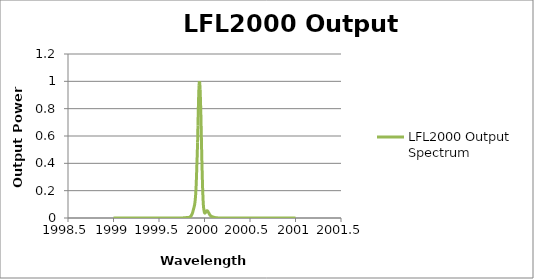
| Category | LFL2000 Output Spectrum |
|---|---|
| 1999.0 | 0 |
| 1999.004 | 0 |
| 1999.008 | 0 |
| 1999.012 | 0 |
| 1999.016 | 0 |
| 1999.02 | 0 |
| 1999.024 | 0 |
| 1999.028 | 0 |
| 1999.032 | 0 |
| 1999.036 | 0 |
| 1999.04 | 0 |
| 1999.044 | 0 |
| 1999.048 | 0 |
| 1999.052 | 0 |
| 1999.056 | 0 |
| 1999.06 | 0 |
| 1999.064 | 0 |
| 1999.068 | 0 |
| 1999.072 | 0 |
| 1999.076 | 0 |
| 1999.08 | 0 |
| 1999.084 | 0 |
| 1999.088 | 0 |
| 1999.092 | 0 |
| 1999.096 | 0 |
| 1999.1 | 0 |
| 1999.104 | 0 |
| 1999.108 | 0 |
| 1999.112 | 0 |
| 1999.116 | 0 |
| 1999.12 | 0 |
| 1999.124 | 0 |
| 1999.128 | 0 |
| 1999.132 | 0 |
| 1999.136 | 0 |
| 1999.14 | 0 |
| 1999.144 | 0 |
| 1999.148 | 0 |
| 1999.152 | 0 |
| 1999.156 | 0 |
| 1999.16 | 0 |
| 1999.164 | 0 |
| 1999.168 | 0 |
| 1999.172 | 0 |
| 1999.176 | 0 |
| 1999.18 | 0 |
| 1999.184 | 0 |
| 1999.188 | 0 |
| 1999.192 | 0 |
| 1999.196 | 0 |
| 1999.2 | 0 |
| 1999.204 | 0 |
| 1999.208 | 0 |
| 1999.212 | 0 |
| 1999.216 | 0 |
| 1999.22 | 0 |
| 1999.224 | 0 |
| 1999.228 | 0 |
| 1999.232 | 0 |
| 1999.236 | 0 |
| 1999.24 | 0 |
| 1999.244 | 0 |
| 1999.248 | 0 |
| 1999.252 | 0 |
| 1999.256 | 0 |
| 1999.26 | 0 |
| 1999.264 | 0 |
| 1999.268 | 0 |
| 1999.272 | 0 |
| 1999.276 | 0 |
| 1999.28 | 0 |
| 1999.284 | 0 |
| 1999.288 | 0 |
| 1999.292 | 0 |
| 1999.296 | 0 |
| 1999.3 | 0 |
| 1999.304 | 0 |
| 1999.308 | 0 |
| 1999.312 | 0 |
| 1999.316 | 0 |
| 1999.32 | 0 |
| 1999.324 | 0 |
| 1999.328 | 0 |
| 1999.332 | 0 |
| 1999.336 | 0 |
| 1999.34 | 0 |
| 1999.344 | 0 |
| 1999.348 | 0 |
| 1999.352 | 0 |
| 1999.356 | 0 |
| 1999.36 | 0 |
| 1999.364 | 0 |
| 1999.368 | 0 |
| 1999.372 | 0 |
| 1999.376 | 0 |
| 1999.38 | 0 |
| 1999.384 | 0 |
| 1999.388 | 0 |
| 1999.392 | 0 |
| 1999.396 | 0 |
| 1999.4 | 0 |
| 1999.404 | 0 |
| 1999.408 | 0 |
| 1999.412 | 0 |
| 1999.416 | 0 |
| 1999.42 | 0 |
| 1999.424 | 0 |
| 1999.428 | 0 |
| 1999.432 | 0 |
| 1999.436 | 0 |
| 1999.44 | 0 |
| 1999.444 | 0 |
| 1999.448 | 0 |
| 1999.452 | 0 |
| 1999.456 | 0 |
| 1999.46 | 0 |
| 1999.464 | 0 |
| 1999.468 | 0 |
| 1999.472 | 0 |
| 1999.476 | 0 |
| 1999.48 | 0 |
| 1999.484 | 0 |
| 1999.488 | 0 |
| 1999.492 | 0 |
| 1999.496 | 0 |
| 1999.5 | 0 |
| 1999.504 | 0 |
| 1999.508 | 0 |
| 1999.512 | 0 |
| 1999.516 | 0 |
| 1999.52 | 0 |
| 1999.524 | 0 |
| 1999.528 | 0 |
| 1999.532 | 0 |
| 1999.536 | 0 |
| 1999.54 | 0 |
| 1999.544 | 0 |
| 1999.548 | 0 |
| 1999.552 | 0 |
| 1999.556 | 0 |
| 1999.56 | 0 |
| 1999.564 | 0 |
| 1999.568 | 0 |
| 1999.572 | 0 |
| 1999.576 | 0 |
| 1999.58 | 0 |
| 1999.584 | 0 |
| 1999.588 | 0 |
| 1999.592 | 0 |
| 1999.596 | 0 |
| 1999.6 | 0 |
| 1999.604 | 0 |
| 1999.608 | 0 |
| 1999.612 | 0 |
| 1999.616 | 0 |
| 1999.62 | 0 |
| 1999.624 | 0 |
| 1999.628 | 0 |
| 1999.632 | 0 |
| 1999.636 | 0 |
| 1999.64 | 0 |
| 1999.644 | 0 |
| 1999.648 | 0 |
| 1999.652 | 0 |
| 1999.656 | 0 |
| 1999.66 | 0 |
| 1999.664 | 0 |
| 1999.668 | 0 |
| 1999.672 | 0 |
| 1999.676 | 0 |
| 1999.68 | 0 |
| 1999.684 | 0 |
| 1999.688 | 0 |
| 1999.692 | 0 |
| 1999.696 | 0 |
| 1999.7 | 0 |
| 1999.704 | 0 |
| 1999.708 | 0 |
| 1999.712 | 0 |
| 1999.716 | 0 |
| 1999.72 | 0 |
| 1999.724 | 0 |
| 1999.728 | 0 |
| 1999.732 | 0 |
| 1999.736 | 0 |
| 1999.74 | 0 |
| 1999.744 | 0.001 |
| 1999.748 | 0.001 |
| 1999.752 | 0.001 |
| 1999.756 | 0.001 |
| 1999.76 | 0.001 |
| 1999.764 | 0.001 |
| 1999.768 | 0.001 |
| 1999.772 | 0.001 |
| 1999.776 | 0.001 |
| 1999.78 | 0.001 |
| 1999.784 | 0.002 |
| 1999.788 | 0.002 |
| 1999.792 | 0.003 |
| 1999.796 | 0.003 |
| 1999.8 | 0.003 |
| 1999.804 | 0.003 |
| 1999.808 | 0.003 |
| 1999.812 | 0.003 |
| 1999.816 | 0.003 |
| 1999.82 | 0.003 |
| 1999.824 | 0.003 |
| 1999.828 | 0.004 |
| 1999.832 | 0.005 |
| 1999.836 | 0.007 |
| 1999.84 | 0.008 |
| 1999.844 | 0.01 |
| 1999.848 | 0.012 |
| 1999.852 | 0.015 |
| 1999.856 | 0.019 |
| 1999.86 | 0.024 |
| 1999.864 | 0.03 |
| 1999.868 | 0.037 |
| 1999.872 | 0.046 |
| 1999.876 | 0.056 |
| 1999.88 | 0.066 |
| 1999.884 | 0.076 |
| 1999.888 | 0.087 |
| 1999.892 | 0.1 |
| 1999.896 | 0.12 |
| 1999.9 | 0.147 |
| 1999.904 | 0.183 |
| 1999.908 | 0.234 |
| 1999.912 | 0.302 |
| 1999.916 | 0.384 |
| 1999.92 | 0.462 |
| 1999.924 | 0.553 |
| 1999.928 | 0.676 |
| 1999.932 | 0.796 |
| 1999.936 | 0.897 |
| 1999.94 | 0.97 |
| 1999.944 | 1 |
| 1999.948 | 0.986 |
| 1999.952 | 0.938 |
| 1999.956 | 0.859 |
| 1999.96 | 0.761 |
| 1999.964 | 0.643 |
| 1999.968 | 0.515 |
| 1999.972 | 0.396 |
| 1999.976 | 0.297 |
| 1999.98 | 0.205 |
| 1999.984 | 0.139 |
| 1999.988 | 0.091 |
| 1999.992 | 0.066 |
| 1999.996 | 0.05 |
| 2000.0 | 0.039 |
| 2000.004 | 0.036 |
| 2000.008 | 0.038 |
| 2000.012 | 0.041 |
| 2000.016 | 0.046 |
| 2000.02 | 0.05 |
| 2000.024 | 0.052 |
| 2000.028 | 0.053 |
| 2000.032 | 0.052 |
| 2000.036 | 0.049 |
| 2000.04 | 0.045 |
| 2000.044 | 0.04 |
| 2000.048 | 0.035 |
| 2000.052 | 0.031 |
| 2000.056 | 0.026 |
| 2000.06 | 0.021 |
| 2000.064 | 0.019 |
| 2000.068 | 0.016 |
| 2000.072 | 0.014 |
| 2000.076 | 0.012 |
| 2000.08 | 0.011 |
| 2000.084 | 0.01 |
| 2000.088 | 0.009 |
| 2000.092 | 0.008 |
| 2000.096 | 0.007 |
| 2000.1 | 0.006 |
| 2000.104 | 0.005 |
| 2000.108 | 0.005 |
| 2000.112 | 0.004 |
| 2000.116 | 0.003 |
| 2000.12 | 0.003 |
| 2000.124 | 0.002 |
| 2000.128 | 0.002 |
| 2000.132 | 0.001 |
| 2000.136 | 0.001 |
| 2000.14 | 0.001 |
| 2000.144 | 0.001 |
| 2000.148 | 0.001 |
| 2000.152 | 0.001 |
| 2000.156 | 0.001 |
| 2000.16 | 0 |
| 2000.164 | 0 |
| 2000.168 | 0 |
| 2000.172 | 0 |
| 2000.176 | 0 |
| 2000.18 | 0 |
| 2000.184 | 0 |
| 2000.188 | 0 |
| 2000.192 | 0 |
| 2000.196 | 0 |
| 2000.2 | 0 |
| 2000.204 | 0 |
| 2000.208 | 0 |
| 2000.212 | 0 |
| 2000.216 | 0 |
| 2000.22 | 0 |
| 2000.224 | 0 |
| 2000.228 | 0 |
| 2000.232 | 0 |
| 2000.236 | 0 |
| 2000.24 | 0 |
| 2000.244 | 0 |
| 2000.248 | 0 |
| 2000.252 | 0 |
| 2000.256 | 0 |
| 2000.26 | 0 |
| 2000.264 | 0 |
| 2000.268 | 0 |
| 2000.272 | 0 |
| 2000.276 | 0 |
| 2000.28 | 0 |
| 2000.284 | 0 |
| 2000.288 | 0 |
| 2000.292 | 0 |
| 2000.296 | 0 |
| 2000.3 | 0 |
| 2000.304 | 0 |
| 2000.308 | 0 |
| 2000.312 | 0 |
| 2000.316 | 0 |
| 2000.32 | 0 |
| 2000.324 | 0 |
| 2000.328 | 0 |
| 2000.332 | 0 |
| 2000.336 | 0 |
| 2000.34 | 0 |
| 2000.344 | 0 |
| 2000.348 | 0 |
| 2000.352 | 0 |
| 2000.356 | 0 |
| 2000.36 | 0 |
| 2000.364 | 0 |
| 2000.368 | 0 |
| 2000.372 | 0 |
| 2000.376 | 0 |
| 2000.38 | 0 |
| 2000.384 | 0 |
| 2000.388 | 0 |
| 2000.392 | 0 |
| 2000.396 | 0 |
| 2000.4 | 0 |
| 2000.404 | 0 |
| 2000.408 | 0 |
| 2000.412 | 0 |
| 2000.416 | 0 |
| 2000.42 | 0 |
| 2000.424 | 0 |
| 2000.428 | 0 |
| 2000.432 | 0 |
| 2000.436 | 0 |
| 2000.44 | 0 |
| 2000.444 | 0 |
| 2000.448 | 0 |
| 2000.452 | 0 |
| 2000.456 | 0 |
| 2000.46 | 0 |
| 2000.464 | 0 |
| 2000.468 | 0 |
| 2000.472 | 0 |
| 2000.476 | 0 |
| 2000.48 | 0 |
| 2000.484 | 0 |
| 2000.488 | 0 |
| 2000.492 | 0 |
| 2000.496 | 0 |
| 2000.5 | 0 |
| 2000.504 | 0 |
| 2000.508 | 0 |
| 2000.512 | 0 |
| 2000.516 | 0 |
| 2000.52 | 0 |
| 2000.524 | 0 |
| 2000.528 | 0 |
| 2000.532 | 0 |
| 2000.536 | 0 |
| 2000.54 | 0 |
| 2000.544 | 0 |
| 2000.548 | 0 |
| 2000.552 | 0 |
| 2000.556 | 0 |
| 2000.56 | 0 |
| 2000.564 | 0 |
| 2000.568 | 0 |
| 2000.572 | 0 |
| 2000.576 | 0 |
| 2000.58 | 0 |
| 2000.584 | 0 |
| 2000.588 | 0 |
| 2000.592 | 0 |
| 2000.596 | 0 |
| 2000.6 | 0 |
| 2000.604 | 0 |
| 2000.608 | 0 |
| 2000.612 | 0 |
| 2000.616 | 0 |
| 2000.62 | 0 |
| 2000.624 | 0 |
| 2000.628 | 0 |
| 2000.632 | 0 |
| 2000.636 | 0 |
| 2000.64 | 0 |
| 2000.644 | 0 |
| 2000.648 | 0 |
| 2000.652 | 0 |
| 2000.656 | 0 |
| 2000.66 | 0 |
| 2000.664 | 0 |
| 2000.668 | 0 |
| 2000.672 | 0 |
| 2000.676 | 0 |
| 2000.68 | 0 |
| 2000.684 | 0 |
| 2000.688 | 0 |
| 2000.692 | 0 |
| 2000.696 | 0 |
| 2000.7 | 0 |
| 2000.704 | 0 |
| 2000.708 | 0 |
| 2000.712 | 0 |
| 2000.716 | 0 |
| 2000.72 | 0 |
| 2000.724 | 0 |
| 2000.728 | 0 |
| 2000.732 | 0 |
| 2000.736 | 0 |
| 2000.74 | 0 |
| 2000.744 | 0 |
| 2000.748 | 0 |
| 2000.752 | 0 |
| 2000.756 | 0 |
| 2000.76 | 0 |
| 2000.764 | 0 |
| 2000.768 | 0 |
| 2000.772 | 0 |
| 2000.776 | 0 |
| 2000.78 | 0 |
| 2000.784 | 0 |
| 2000.788 | 0 |
| 2000.792 | 0 |
| 2000.796 | 0 |
| 2000.8 | 0 |
| 2000.804 | 0 |
| 2000.808 | 0 |
| 2000.812 | 0 |
| 2000.816 | 0 |
| 2000.82 | 0 |
| 2000.824 | 0 |
| 2000.828 | 0 |
| 2000.832 | 0 |
| 2000.836 | 0 |
| 2000.84 | 0 |
| 2000.844 | 0 |
| 2000.848 | 0 |
| 2000.852 | 0 |
| 2000.856 | 0 |
| 2000.86 | 0 |
| 2000.864 | 0 |
| 2000.868 | 0 |
| 2000.872 | 0 |
| 2000.876 | 0 |
| 2000.88 | 0 |
| 2000.884 | 0 |
| 2000.888 | 0 |
| 2000.892 | 0 |
| 2000.896 | 0 |
| 2000.9 | 0 |
| 2000.904 | 0 |
| 2000.908 | 0 |
| 2000.912 | 0 |
| 2000.916 | 0 |
| 2000.92 | 0 |
| 2000.924 | 0 |
| 2000.928 | 0 |
| 2000.932 | 0 |
| 2000.936 | 0 |
| 2000.94 | 0 |
| 2000.944 | 0 |
| 2000.948 | 0 |
| 2000.952 | 0 |
| 2000.956 | 0 |
| 2000.96 | 0 |
| 2000.964 | 0 |
| 2000.968 | 0 |
| 2000.972 | 0 |
| 2000.976 | 0 |
| 2000.98 | 0 |
| 2000.984 | 0 |
| 2000.988 | 0 |
| 2000.992 | 0 |
| 2000.996 | 0 |
| 2001.0 | 0 |